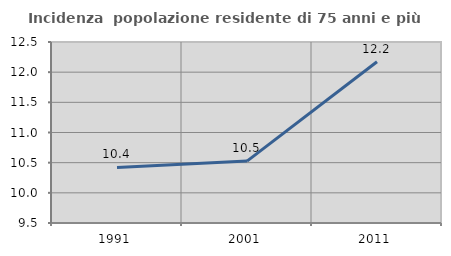
| Category | Incidenza  popolazione residente di 75 anni e più |
|---|---|
| 1991.0 | 10.42 |
| 2001.0 | 10.526 |
| 2011.0 | 12.172 |